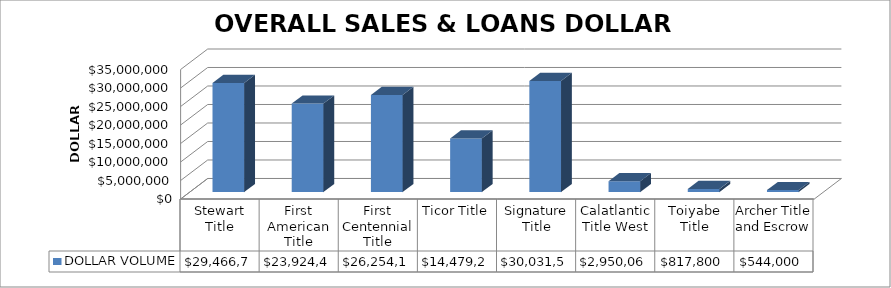
| Category | DOLLAR VOLUME |
|---|---|
| Stewart Title | 29466708 |
| First American Title | 23924474.5 |
| First Centennial Title | 26254115 |
| Ticor Title | 14479275 |
| Signature Title | 30031599 |
| Calatlantic Title West | 2950065 |
| Toiyabe Title | 817800 |
| Archer Title and Escrow | 544000 |